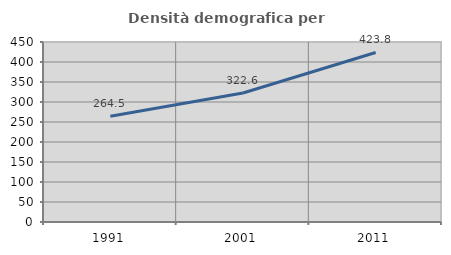
| Category | Densità demografica |
|---|---|
| 1991.0 | 264.458 |
| 2001.0 | 322.556 |
| 2011.0 | 423.8 |